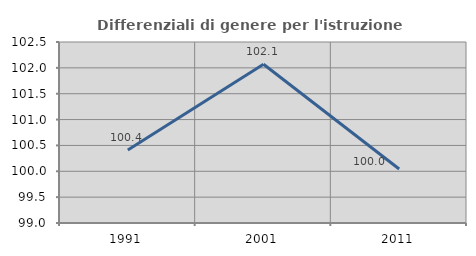
| Category | Differenziali di genere per l'istruzione superiore |
|---|---|
| 1991.0 | 100.412 |
| 2001.0 | 102.069 |
| 2011.0 | 100.045 |